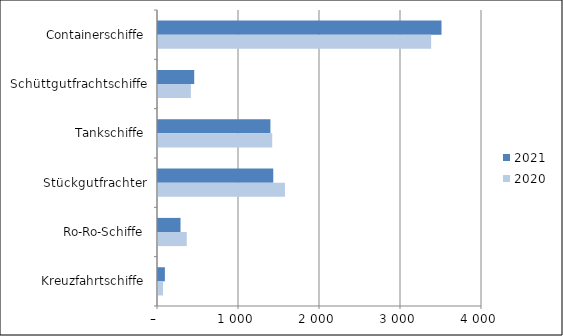
| Category | 2021 | 2020 |
|---|---|---|
| Containerschiffe | 3500 | 3372 |
| Schüttgutfrachtschiffe | 447 | 406 |
| Tankschiffe | 1388 | 1410 |
| Stückgutfrachter | 1423 | 1567 |
| Ro-Ro-Schiffe | 278 | 355 |
| Kreuzfahrtschiffe | 85 | 62 |